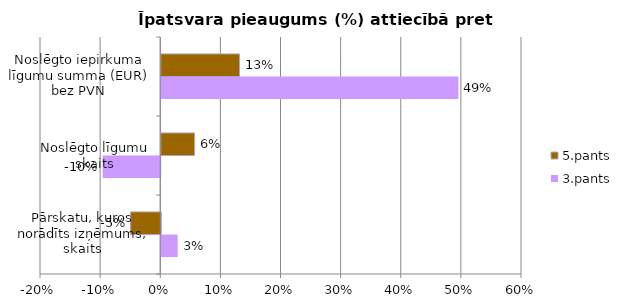
| Category | 3.pants | 5.pants |
|---|---|---|
| Pārskatu, kuros norādīts izņēmums, skaits | 0.027 | -0.05 |
| Noslēgto līgumu skaits | -0.096 | 0.055 |
| Noslēgto iepirkuma līgumu summa (EUR) bez PVN | 0.494 | 0.13 |